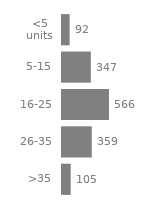
| Category | Series 0 |
|---|---|
| <5 units | 92 |
| 5-15 | 347 |
| 16-25 | 566 |
| 26-35 | 359 |
| >35 | 105 |